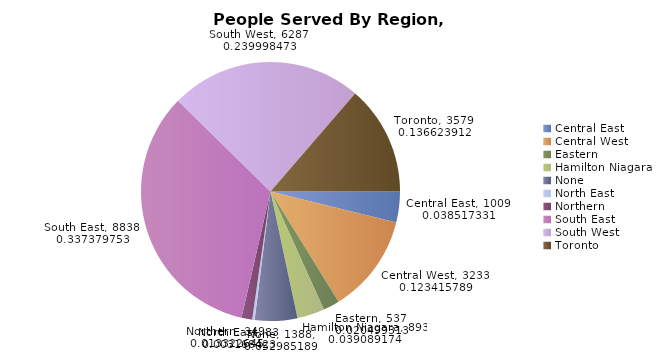
| Category | Served |
|---|---|
| Central East | 1009 |
| Central West | 3233 |
| Eastern | 537 |
| Hamilton Niagara | 893 |
| None | 1388 |
| North East | 83 |
| Northern | 349 |
| South East | 8838 |
| South West | 6287 |
| Toronto | 3579 |